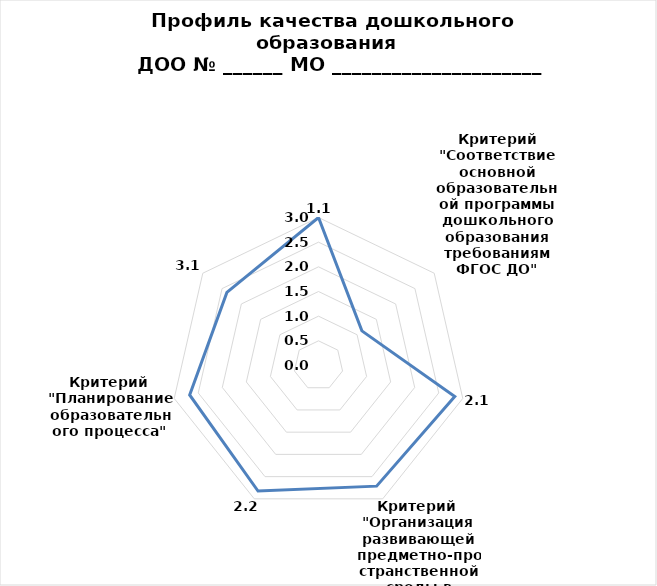
| Category | Series 0 |
|---|---|
| 0 | 3 |
| 1 | 1.125 |
| 2 | 2.833 |
| 3 | 2.714 |
| 4 | 2.825 |
| 5 | 2.679 |
| 6 | 2.375 |